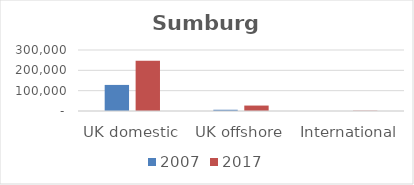
| Category | 2007 | 2017 |
|---|---|---|
| UK domestic | 128265 | 246992 |
| UK offshore | 6141 | 26731 |
| International | 0 | 1374 |